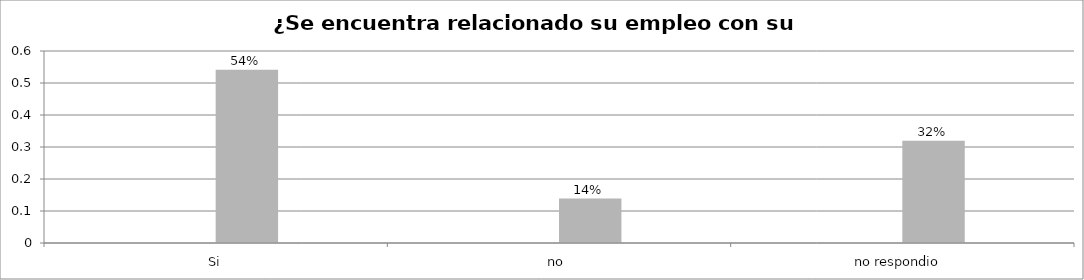
| Category | Series 0 | Series 1 | Series 2 | Series 3 |
|---|---|---|---|---|
| Si |  |  | 0.542 |  |
| no  |  |  | 0.139 |  |
| no respondio  |  |  | 0.319 |  |